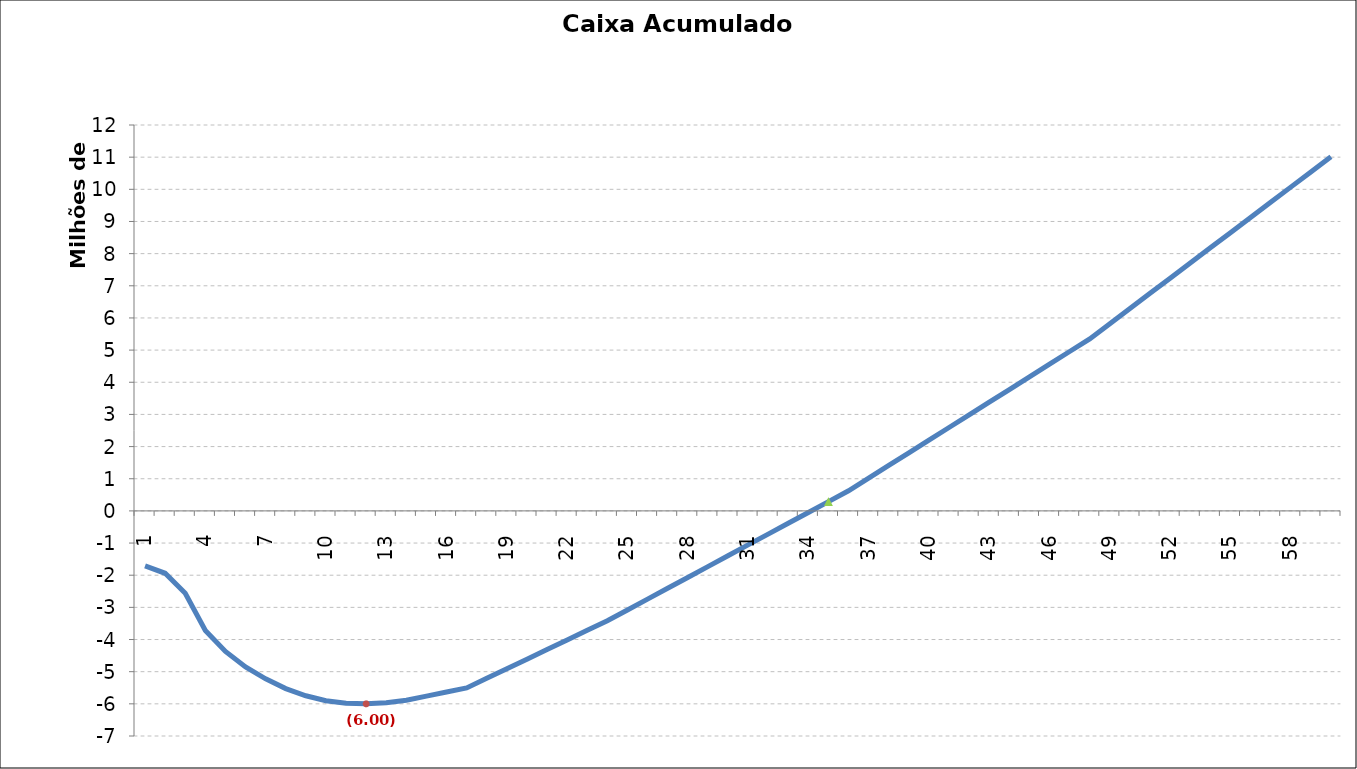
| Category | Caixa Acumulado [R$] |
|---|---|
| 0 | -1710950 |
| 1 | -1939900 |
| 2 | -2563950 |
| 3 | -3721200 |
| 4 | -4369450 |
| 5 | -4854428.958 |
| 6 | -5221807.916 |
| 7 | -5525102.913 |
| 8 | -5749531.749 |
| 9 | -5902394.424 |
| 10 | -5984290.938 |
| 11 | -5999930.291 |
| 12 | -5966925.138 |
| 13 | -5886158.318 |
| 14 | -5758553.832 |
| 15 | -5633259.347 |
| 16 | -5505654.861 |
| 17 | -5207077.375 |
| 18 | -4907839.889 |
| 19 | -4610912.403 |
| 20 | -4311674.918 |
| 21 | -4012437.432 |
| 22 | -3713199.946 |
| 23 | -3417196.46 |
| 24 | -3079738.33 |
| 25 | -2742280.199 |
| 26 | -2404822.069 |
| 27 | -2069673.938 |
| 28 | -1732875.808 |
| 29 | -1395417.677 |
| 30 | -1057959.547 |
| 31 | -722811.416 |
| 32 | -385353.286 |
| 33 | -47895.155 |
| 34 | 289562.975 |
| 35 | 624711.106 |
| 36 | 1018142.707 |
| 37 | 1412498.309 |
| 38 | 1806853.91 |
| 39 | 2198899.511 |
| 40 | 2593255.113 |
| 41 | 2986950.714 |
| 42 | 3381306.315 |
| 43 | 3773351.917 |
| 44 | 4167707.518 |
| 45 | 4562063.119 |
| 46 | 4956418.721 |
| 47 | 5348464.322 |
| 48 | 5820138.622 |
| 49 | 6292736.921 |
| 50 | 6765335.22 |
| 51 | 7235623.52 |
| 52 | 7708221.819 |
| 53 | 8180160.119 |
| 54 | 8652758.418 |
| 55 | 9123046.718 |
| 56 | 9595645.017 |
| 57 | 10068243.316 |
| 58 | 10540841.616 |
| 59 | 11011129.915 |